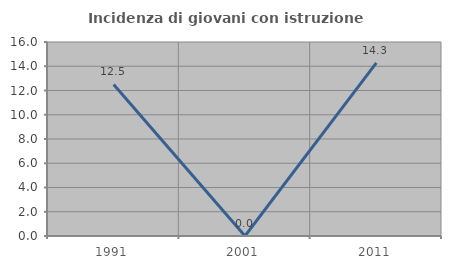
| Category | Incidenza di giovani con istruzione universitaria |
|---|---|
| 1991.0 | 12.5 |
| 2001.0 | 0 |
| 2011.0 | 14.286 |